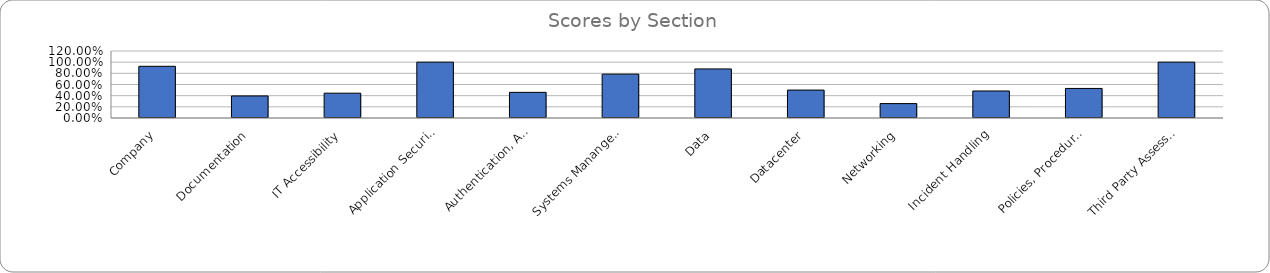
| Category | Series 0 |
|---|---|
| Company | 0.926 |
| Documentation | 0.395 |
| IT Accessibility | 0.444 |
| Application Security | 1 |
| Authentication, Authorization, and Accounting | 0.459 |
| Systems Manangement | 0.786 |
| Data | 0.879 |
| Datacenter | 0.5 |
| Networking | 0.258 |
| Incident Handling | 0.484 |
| Policies, Procedures, and Practices | 0.529 |
| Third Party Assessment | 1 |